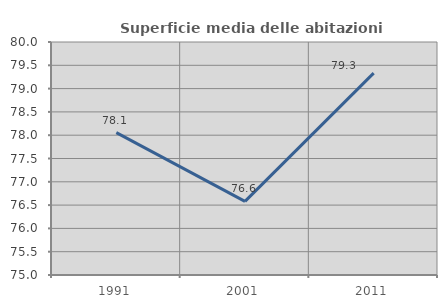
| Category | Superficie media delle abitazioni occupate |
|---|---|
| 1991.0 | 78.054 |
| 2001.0 | 76.579 |
| 2011.0 | 79.331 |